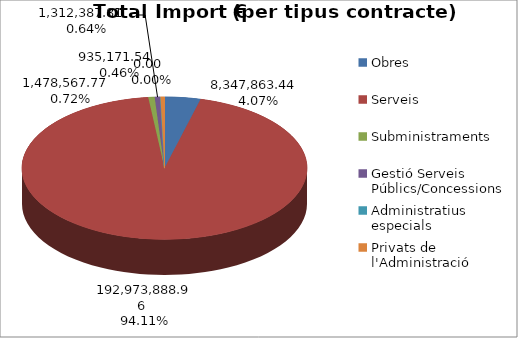
| Category | TOTALS per tipus contracte Total Import (€) |
|---|---|
| Obres | 8347863.44 |
| Serveis | 192973888.96 |
| Subministraments | 1478567.77 |
| Gestió Serveis Públics/Concessions | 1312387.81 |
| Administratius especials | 0 |
| Privats de l'Administració | 935171.54 |